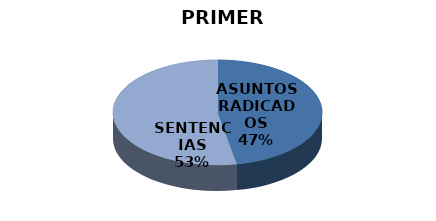
| Category | Series 0 |
|---|---|
| ASUNTOS RADICADOS | 8 |
| SENTENCIAS | 9 |